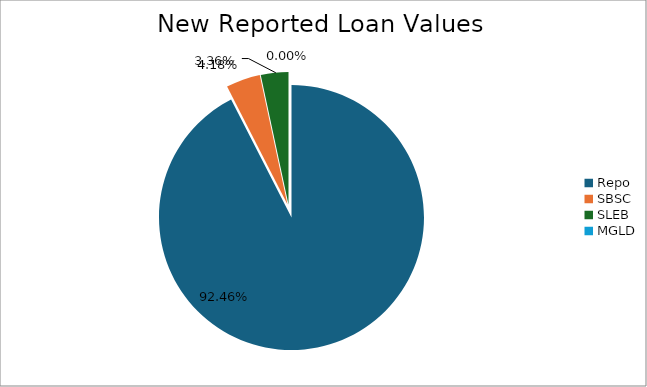
| Category | Series 0 |
|---|---|
| Repo | 13721049.336 |
| SBSC | 619794.225 |
| SLEB | 498180.257 |
| MGLD | 241.567 |